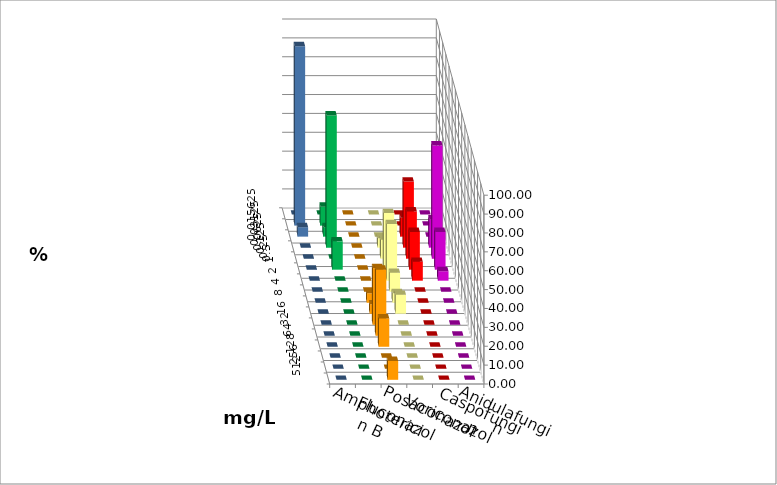
| Category | Amphotericin B | Fluconazol | Posaconazol | Voriconazol | Caspofungin | Anidulafungin |
|---|---|---|---|---|---|---|
| 0.015625 | 0 | 0 | 0 | 0 | 0 | 0 |
| 0.03125 | 10 | 0 | 0 | 0 | 0 | 95 |
| 0.0625 | 5 | 0 | 0 | 10 | 0 | 5 |
| 0.125 | 70 | 0 | 5 | 35 | 15 | 0 |
| 0.25 | 0 | 0 | 10 | 25 | 60 | 0 |
| 0.5 | 15 | 0 | 30 | 20 | 20 | 0 |
| 1.0 | 0 | 0 | 30 | 10 | 5 | 0 |
| 2.0 | 0 | 0 | 10 | 0 | 0 | 0 |
| 4.0 | 0 | 5 | 5 | 0 | 0 | 0 |
| 8.0 | 0 | 5 | 10 | 0 | 0 | 0 |
| 16.0 | 0 | 30 | 0 | 0 | 0 | 0 |
| 32.0 | 0 | 35 | 0 | 0 | 0 | 0 |
| 64.0 | 0 | 15 | 0 | 0 | 0 | 0 |
| 128.0 | 0 | 0 | 0 | 0 | 0 | 0 |
| 256.0 | 0 | 0 | 0 | 0 | 0 | 0 |
| 512.0 | 0 | 10 | 0 | 0 | 0 | 0 |